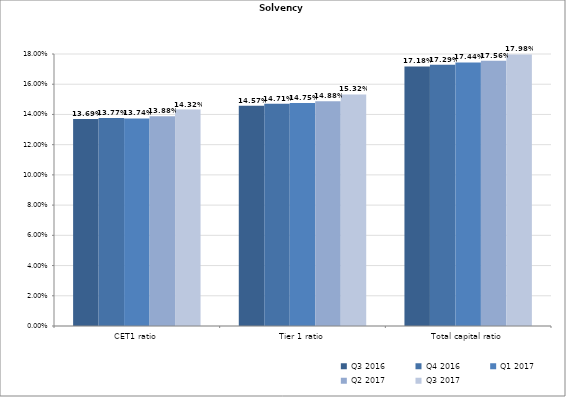
| Category | Q3 2016 | Q4 2016 | Q1 2017 | Q2 2017 | Q3 2017 |
|---|---|---|---|---|---|
| CET1 ratio | 0.137 | 0.138 | 0.137 | 0.139 | 0.143 |
| Tier 1 ratio | 0.146 | 0.147 | 0.147 | 0.149 | 0.153 |
| Total capital ratio | 0.172 | 0.173 | 0.174 | 0.176 | 0.18 |